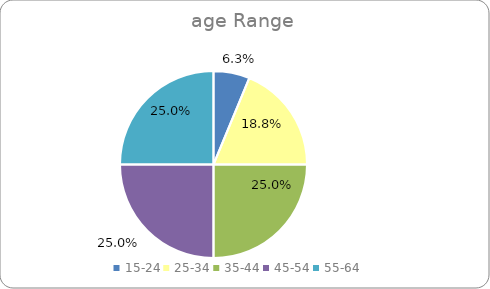
| Category | Series 0 |
|---|---|
| 15-24 | 0.062 |
| 25-34 | 0.188 |
| 35-44 | 0.25 |
| 45-54 | 0.25 |
| 55-64 | 0.25 |